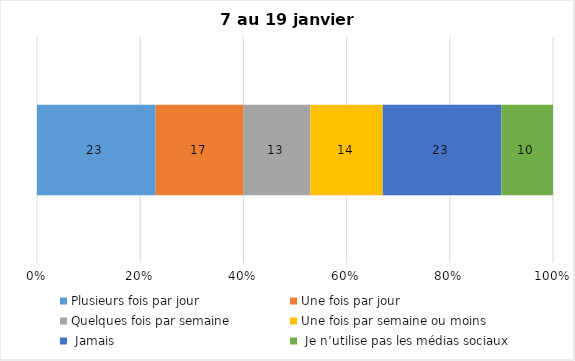
| Category | Plusieurs fois par jour | Une fois par jour | Quelques fois par semaine   | Une fois par semaine ou moins   |  Jamais   |  Je n’utilise pas les médias sociaux |
|---|---|---|---|---|---|---|
| 0 | 23 | 17 | 13 | 14 | 23 | 10 |